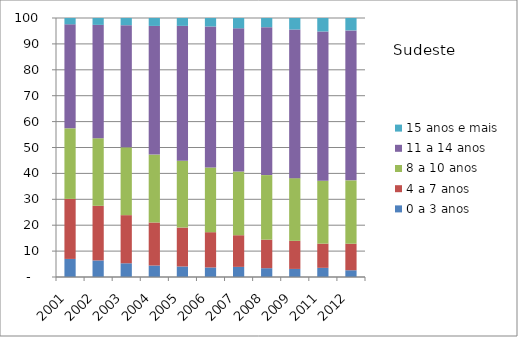
| Category | 0 a 3 anos | 4 a 7 anos | 8 a 10 anos | 11 a 14 anos | 15 anos e mais |
|---|---|---|---|---|---|
| 2001.0 | 6.98 | 23.18 | 27.24 | 40.16 | 2.44 |
| 2002.0 | 6.4 | 21.09 | 26.08 | 43.78 | 2.66 |
| 2003.0 | 5.3 | 18.58 | 26.18 | 47.16 | 2.79 |
| 2004.0 | 4.43 | 16.61 | 26.23 | 49.67 | 3.06 |
| 2005.0 | 4.06 | 15.02 | 25.8 | 52.09 | 3.04 |
| 2006.0 | 3.68 | 13.63 | 24.99 | 54.43 | 3.27 |
| 2007.0 | 3.91 | 12.22 | 24.6 | 55.29 | 3.98 |
| 2008.0 | 3.4 | 11.03 | 24.91 | 57.11 | 3.54 |
| 2009.0 | 3.12 | 10.84 | 24.21 | 57.39 | 4.44 |
| 2011.0 | 3.54 | 9.34 | 24.3 | 57.62 | 5.2 |
| 2012.0 | 2.61 | 10.24 | 24.47 | 57.9 | 4.77 |